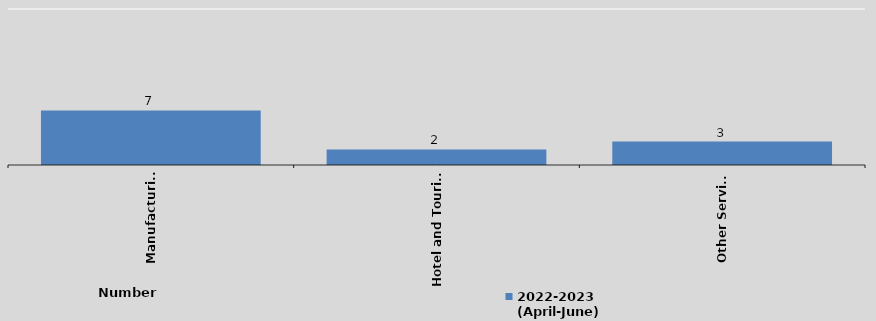
| Category | 2022-2023 
(April-June)
 |
|---|---|
| Manufacturing | 7 |
| Hotel and Tourism | 2 |
| Other Services | 3 |